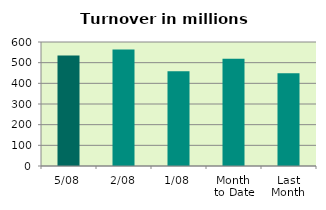
| Category | Series 0 |
|---|---|
| 5/08 | 534.583 |
| 2/08 | 563.111 |
| 1/08 | 458.518 |
| Month 
to Date | 518.737 |
| Last
Month | 448.907 |